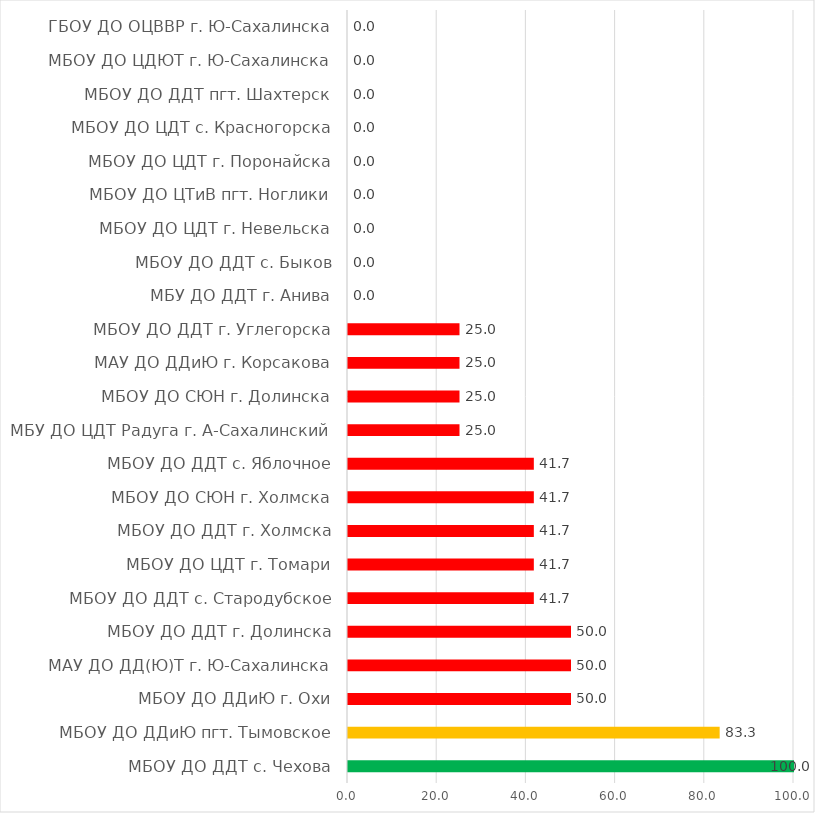
| Category | Series 0 |
|---|---|
| МБОУ ДО ДДТ с. Чехова | 100 |
| МБОУ ДО ДДиЮ пгт. Тымовское | 83.333 |
| МБОУ ДО ДДиЮ г. Охи | 50 |
| МАУ ДО ДД(Ю)Т г. Ю-Сахалинска | 50 |
| МБОУ ДО ДДТ г. Долинска | 50 |
| МБОУ ДО ДДТ с. Стародубское | 41.667 |
| МБОУ ДО ЦДТ г. Томари | 41.667 |
| МБОУ ДО ДДТ г. Холмска | 41.667 |
| МБОУ ДО СЮН г. Холмска | 41.667 |
| МБОУ ДО ДДТ с. Яблочное | 41.667 |
| МБУ ДО ЦДТ Радуга г. А-Сахалинский | 25 |
| МБОУ ДО СЮН г. Долинска | 25 |
| МАУ ДО ДДиЮ г. Корсакова | 25 |
| МБОУ ДО ДДТ г. Углегорска | 25 |
| МБУ ДО ДДТ г. Анива | 0 |
| МБОУ ДО ДДТ с. Быков | 0 |
| МБОУ ДО ЦДТ г. Невельска | 0 |
| МБОУ ДО ЦТиВ пгт. Ноглики | 0 |
| МБОУ ДО ЦДТ г. Поронайска | 0 |
| МБОУ ДО ЦДТ с. Красногорска | 0 |
| МБОУ ДО ДДТ пгт. Шахтерск | 0 |
| МБОУ ДО ЦДЮТ г. Ю-Сахалинска | 0 |
| ГБОУ ДО ОЦВВР г. Ю-Сахалинска | 0 |